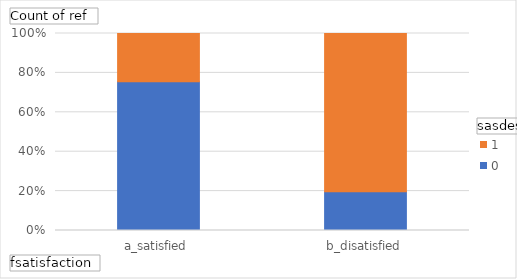
| Category | 0 | 1 |
|---|---|---|
| a_satisfied | 1647 | 536 |
| b_disatisfied | 23 | 94 |